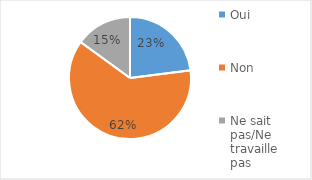
| Category | Series 0 |
|---|---|
| Oui | 0.23 |
| Non | 0.62 |
| Ne sait pas/Ne travaille pas | 0.15 |